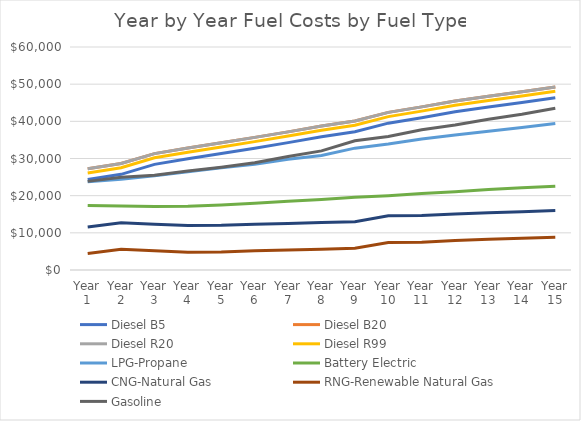
| Category | Diesel B5 | Diesel B20 | Diesel R20 | Diesel R99 | LPG-Propane | Battery Electric | CNG-Natural Gas | RNG-Renewable Natural Gas | Gasoline |
|---|---|---|---|---|---|---|---|---|---|
| Year 1 | 24321.753 | 27217.174 | 27217.174 | 26075.73 | 23744.867 | 17370.654 | 11588.101 | 4437.677 | 23844.526 |
| Year 2 | 25742.615 | 28638.036 | 28638.036 | 27496.592 | 24402.797 | 17199.459 | 12742.19 | 5591.766 | 24953.247 |
| Year 3 | 28424.246 | 31319.667 | 31319.667 | 30178.224 | 25370.24 | 17102.94 | 12329.07 | 5178.647 | 25517.56 |
| Year 4 | 29933.729 | 32829.15 | 32829.15 | 31687.707 | 26463.832 | 17133.633 | 11953.292 | 4802.868 | 26654.91 |
| Year 5 | 31336.253 | 34231.674 | 34231.674 | 33090.23 | 27519.774 | 17476.1 | 12016.592 | 4866.168 | 27657.843 |
| Year 6 | 32784.989 | 35680.41 | 35680.41 | 34538.966 | 28459.591 | 17992.469 | 12299.878 | 5149.454 | 28833.923 |
| Year 7 | 34272.208 | 37167.629 | 37167.629 | 36026.185 | 29789.399 | 18484.059 | 12508.22 | 5357.797 | 30548.181 |
| Year 8 | 35839.021 | 38734.442 | 38734.442 | 37592.999 | 30830.528 | 18998.098 | 12755.585 | 5605.162 | 32051.824 |
| Year 9 | 37207.05 | 40102.471 | 40102.471 | 38961.027 | 32787.379 | 19550.01 | 13012.974 | 5862.55 | 34770.041 |
| Year 10 | 39510.402 | 42405.823 | 42405.823 | 41264.379 | 33880.907 | 19998.527 | 14563.797 | 7413.373 | 35916.387 |
| Year 11 | 40990.223 | 43885.644 | 43885.644 | 42744.2 | 35227.158 | 20561.935 | 14648.981 | 7498.557 | 37722.851 |
| Year 12 | 42560.111 | 45455.532 | 45455.532 | 44314.088 | 36308.179 | 21033.644 | 15092.196 | 7941.772 | 39021.633 |
| Year 13 | 43842.16 | 46737.581 | 46737.581 | 45596.138 | 37305.245 | 21635.677 | 15420.637 | 8270.213 | 40577.628 |
| Year 14 | 45059.167 | 47954.588 | 47954.588 | 46813.145 | 38315.238 | 22145.162 | 15699.656 | 8549.233 | 41909.217 |
| Year 15 | 46343.394 | 49238.815 | 49238.815 | 48097.371 | 39412.6 | 22562.999 | 15981.431 | 8831.007 | 43499.719 |